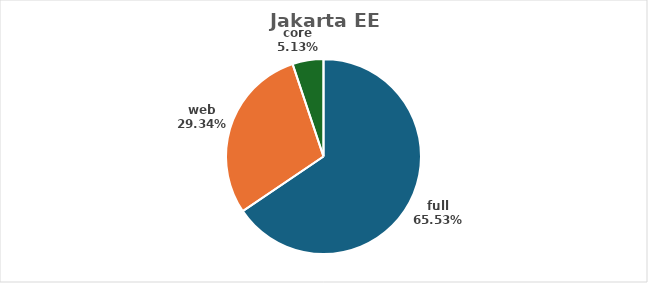
| Category | full |
|---|---|
| full | 0.655 |
| web | 0.293 |
| core | 0.051 |